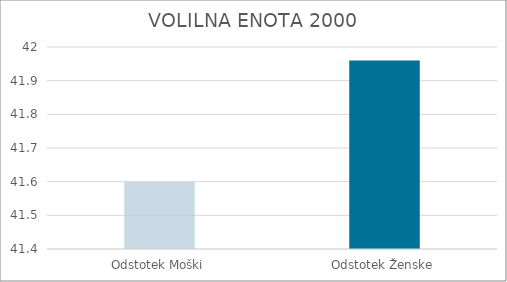
| Category | Series 0 |
|---|---|
| Odstotek Moški | 41.6 |
| Odstotek Ženske | 41.96 |